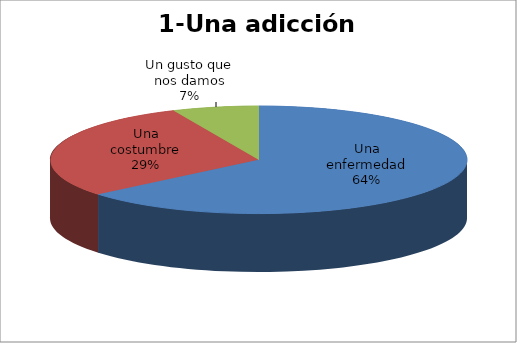
| Category | Series 0 |
|---|---|
| Una enfermedad | 211 |
| Una costumbre | 97 |
| Un gusto que nos damos | 22 |